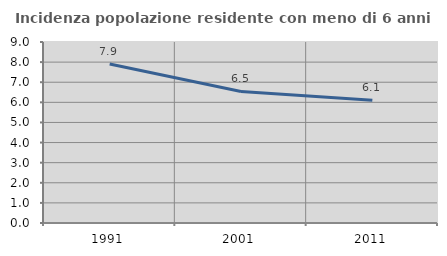
| Category | Incidenza popolazione residente con meno di 6 anni |
|---|---|
| 1991.0 | 7.903 |
| 2001.0 | 6.542 |
| 2011.0 | 6.108 |